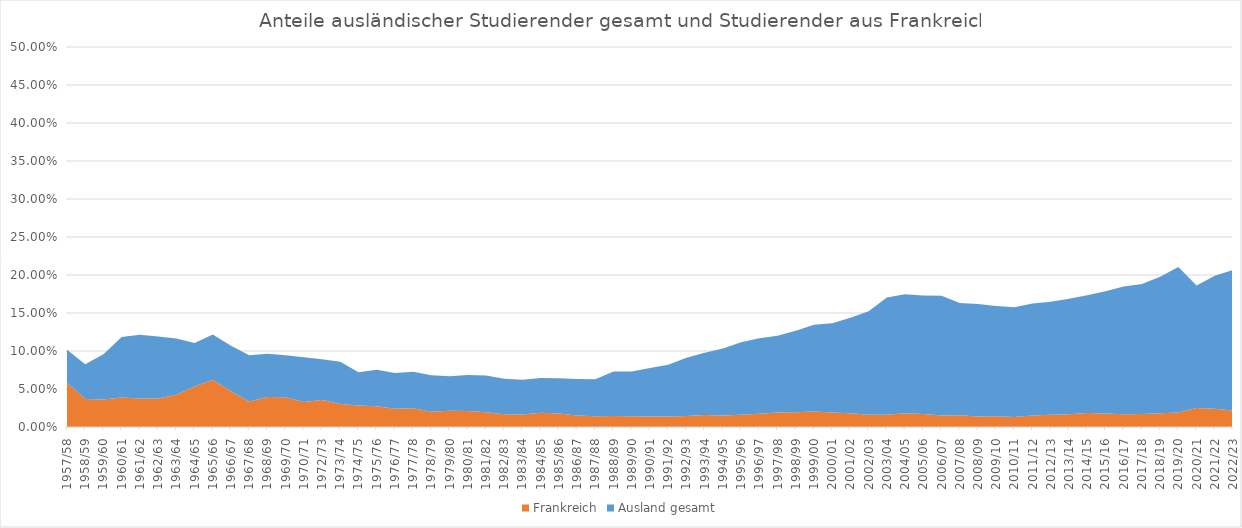
| Category | Frankreich | Ausland gesamt |
|---|---|---|
| 1957/58 | 0.058 | 0.044 |
| 1958/59 | 0.037 | 0.046 |
| 1959/60 | 0.036 | 0.06 |
| 1960/61 | 0.039 | 0.079 |
| 1961/62 | 0.038 | 0.084 |
| 1962/63 | 0.037 | 0.082 |
| 1963/64 | 0.042 | 0.074 |
| 1964/65 | 0.053 | 0.057 |
| 1965/66 | 0.062 | 0.06 |
| 1966/67 | 0.047 | 0.06 |
| 1967/68 | 0.034 | 0.061 |
| 1968/69 | 0.04 | 0.057 |
| 1969/70 | 0.039 | 0.055 |
| 1970/71 | 0.033 | 0.059 |
| 1972/73 | 0.036 | 0.054 |
| 1973/74 | 0.03 | 0.056 |
| 1974/75 | 0.028 | 0.044 |
| 1975/76 | 0.027 | 0.048 |
| 1976/77 | 0.024 | 0.047 |
| 1977/78 | 0.025 | 0.048 |
| 1978/79 | 0.02 | 0.048 |
| 1979/80 | 0.021 | 0.045 |
| 1980/81 | 0.021 | 0.047 |
| 1981/82 | 0.02 | 0.048 |
| 1982/83 | 0.017 | 0.047 |
| 1983/84 | 0.016 | 0.046 |
| 1984/85 | 0.019 | 0.046 |
| 1985/86 | 0.018 | 0.046 |
| 1986/87 | 0.015 | 0.048 |
| 1987/88 | 0.014 | 0.049 |
| 1988/89 | 0.015 | 0.059 |
| 1989/90 | 0.014 | 0.059 |
| 1990/91 | 0.014 | 0.064 |
| 1991/92 | 0.014 | 0.068 |
| 1992/93 | 0.015 | 0.077 |
| 1993/94 | 0.016 | 0.082 |
| 1994/95 | 0.015 | 0.088 |
| 1995/96 | 0.016 | 0.095 |
| 1996/97 | 0.017 | 0.099 |
| 1997/98 | 0.019 | 0.101 |
| 1998/99 | 0.019 | 0.107 |
| 1999/00 | 0.02 | 0.114 |
| 2000/01 | 0.019 | 0.117 |
| 2001/02 | 0.018 | 0.126 |
| 2002/03 | 0.016 | 0.136 |
| 2003/04 | 0.016 | 0.154 |
| 2004/05 | 0.018 | 0.157 |
| 2005/06 | 0.017 | 0.156 |
| 2006/07 | 0.015 | 0.157 |
| 2007/08 | 0.015 | 0.148 |
| 2008/09 | 0.014 | 0.148 |
| 2009/10 | 0.014 | 0.145 |
| 2010/11 | 0.013 | 0.144 |
| 2011/12 | 0.015 | 0.148 |
| 2012/13 | 0.016 | 0.149 |
| 2013/14 | 0.017 | 0.152 |
| 2014/15 | 0.018 | 0.155 |
| 2015/16 | 0.018 | 0.161 |
| 2016/17 | 0.017 | 0.168 |
| 2017/18 | 0.017 | 0.171 |
| 2018/19 | 0.018 | 0.179 |
| 2019/20 | 0.019 | 0.192 |
| 2020/21 | 0.025 | 0.161 |
| 2021/22 | 0.024 | 0.175 |
| 2022/23 | 0.022 | 0.185 |